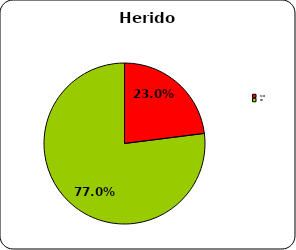
| Category | Herido leve |
|---|---|
| No | 23 |
| Si | 77 |